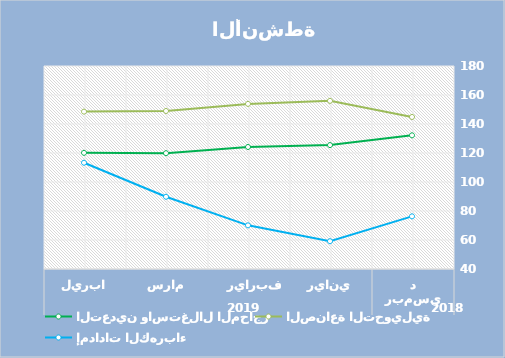
| Category | التعدين واستغلال المحاجر | الصناعة التحويلية | إمدادات الكهرباء |
|---|---|---|---|
| 0 | 132.18 | 144.85 | 76.31 |
| 1 | 125.45 | 155.98 | 59.15 |
| 2 | 124.14 | 153.87 | 70.1 |
| 3 | 119.87 | 148.98 | 89.82 |
| 4 | 120.11 | 148.54 | 113.29 |